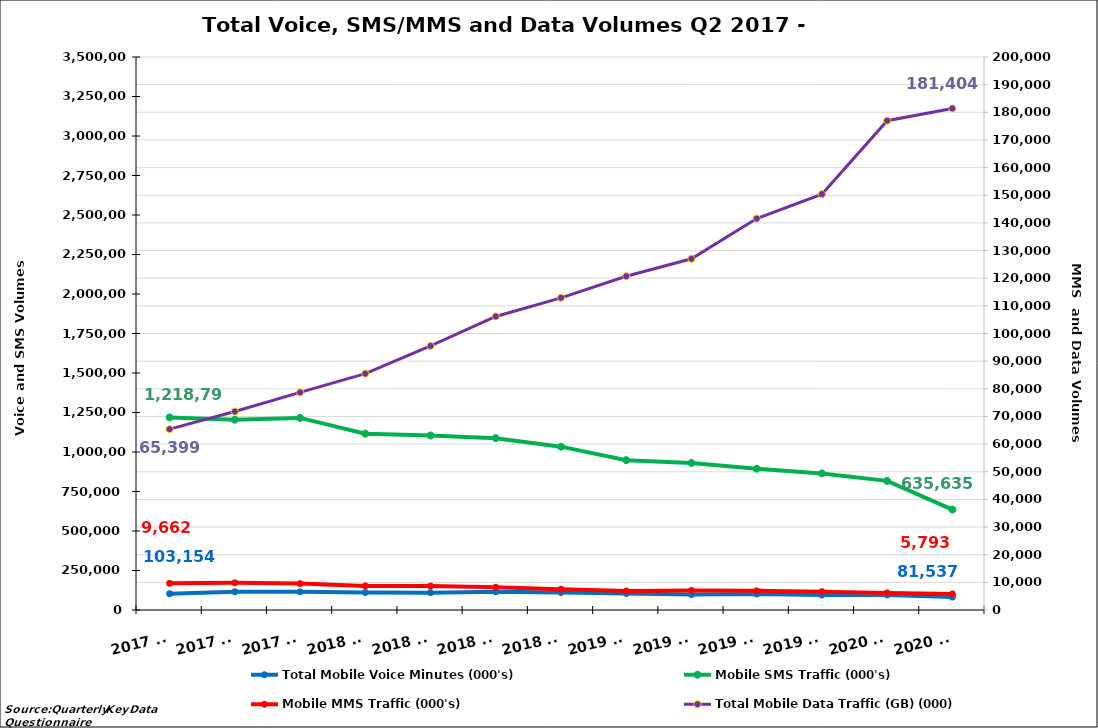
| Category | Total Mobile Voice Minutes (000's) | Mobile SMS Traffic (000's) |
|---|---|---|
| 2017 Q2 | 103153.626 | 1218791.82 |
| 2017 Q3 | 115579.059 | 1204368.619 |
| 2017 Q4 | 115214.312 | 1215724.329 |
| 2018 Q1 | 110806.011 | 1116125.96 |
| 2018 Q2 | 109832.006 | 1104263.271 |
| 2018 Q3 | 115680.856 | 1087595.075 |
| 2018 Q4 | 110600.636 | 1033800.637 |
| 2019 Q1 | 104666.386 | 948453.641 |
| 2019 Q2 | 97784.803 | 930671.841 |
| 2019 Q3 | 101431.447 | 894408.206 |
| 2019 Q4 | 94528.618 | 864343.063 |
| 2020 Q1 | 95362.079 | 817190.979 |
| 2020 Q2 | 81537.186 | 635634.771 |